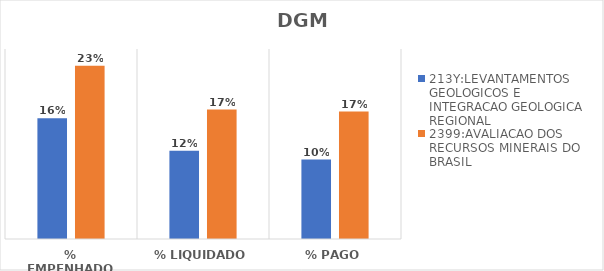
| Category | 213Y:LEVANTAMENTOS GEOLOGICOS E INTEGRACAO GEOLOGICA REGIONAL | 2399:AVALIACAO DOS RECURSOS MINERAIS DO BRASIL |
|---|---|---|
| % EMPENHADO | 0.159 | 0.228 |
| % LIQUIDADO | 0.116 | 0.17 |
| % PAGO | 0.105 | 0.168 |